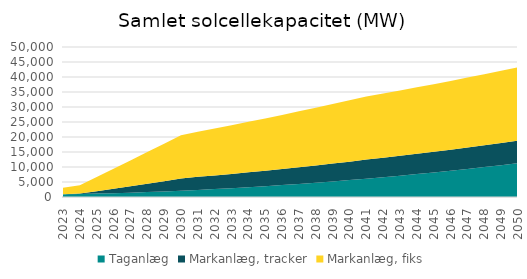
| Category | Taganlæg | Markanlæg, tracker | Markanlæg, fiks |
|---|---|---|---|
| 2023.0 | 895 | 0 | 2220 |
| 2024.0 | 1004 | 175 | 2744 |
| 2025.0 | 1134 | 824 | 4694 |
| 2026.0 | 1285 | 1474 | 6644 |
| 2027.0 | 1458 | 2124 | 8594 |
| 2028.0 | 1651 | 2774 | 10544 |
| 2029.0 | 1865 | 3424 | 12494 |
| 2030.0 | 2101 | 4074 | 14444 |
| 2031.0 | 2358 | 4362 | 15045 |
| 2032.0 | 2636 | 4563 | 15644 |
| 2033.0 | 2936 | 4763 | 16245 |
| 2034.0 | 3258 | 4962 | 16844 |
| 2035.0 | 3600 | 5162 | 17445 |
| 2036.0 | 3963 | 5363 | 18044 |
| 2037.0 | 4348 | 5563 | 18645 |
| 2038.0 | 4753 | 5762 | 19244 |
| 2039.0 | 5180 | 5962 | 19845 |
| 2040.0 | 5628 | 6163 | 20444 |
| 2041.0 | 6098 | 6363 | 21045 |
| 2042.0 | 6588 | 6512 | 21419 |
| 2043.0 | 7100 | 6638 | 21795 |
| 2044.0 | 7633 | 6763 | 22169 |
| 2045.0 | 8188 | 6887 | 22545 |
| 2046.0 | 8763 | 7012 | 22919 |
| 2047.0 | 9360 | 7138 | 23295 |
| 2048.0 | 9978 | 7263 | 23669 |
| 2049.0 | 10617 | 7387 | 24045 |
| 2050.0 | 11278 | 7512 | 24419 |